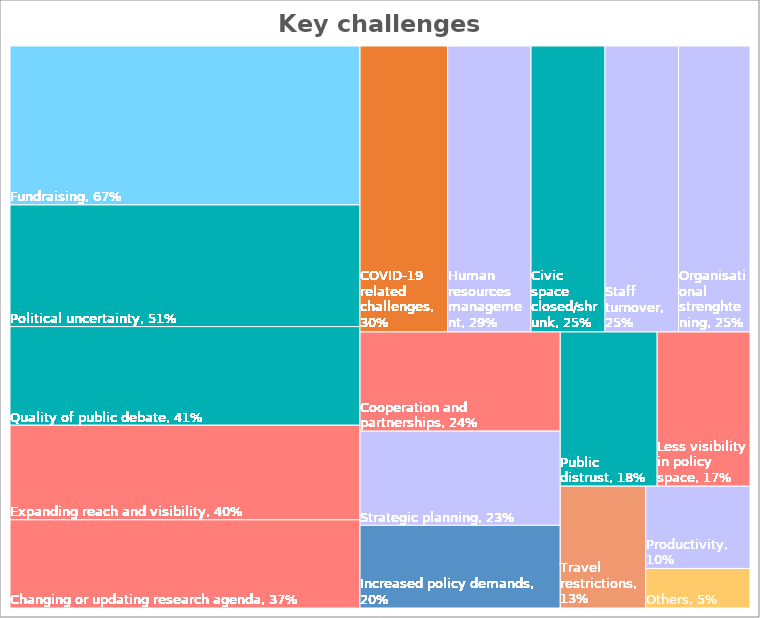
| Category | Female | Male |
|---|---|---|
| Fundraising | 80 | 65.4 |
| Cooperation and partnerships | 29.6 | 18.5 |
| Civic space closed/shrunk | 38.2 | 18.5 |
| COVID-19 related challenges | 18.2 | 34 |
| Expanding reach and visibility | 51.9 | 35.2 |
| Quality of public debate | 37 | 44.4 |
| Organisational strenghtening | 37 | 19.1 |